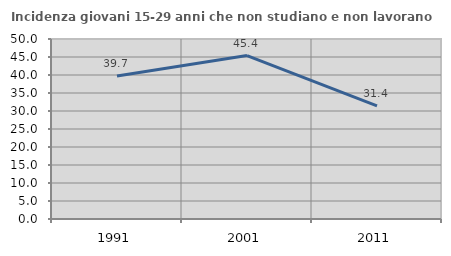
| Category | Incidenza giovani 15-29 anni che non studiano e non lavorano  |
|---|---|
| 1991.0 | 39.698 |
| 2001.0 | 45.392 |
| 2011.0 | 31.41 |